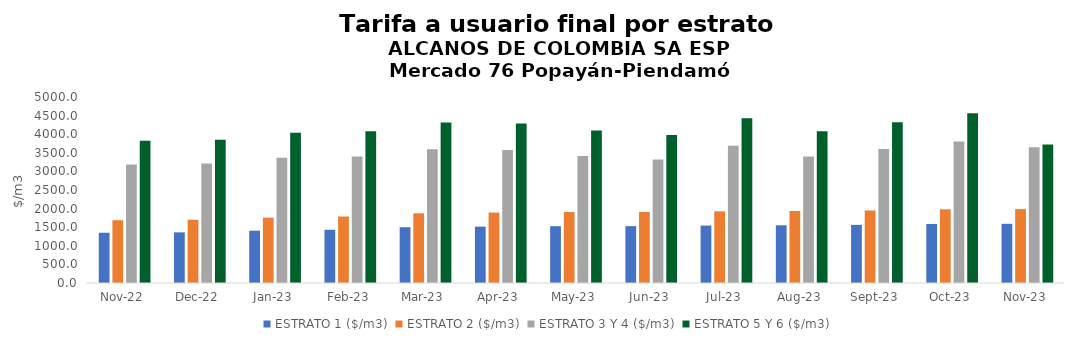
| Category | ESTRATO 1 ($/m3) | ESTRATO 2 ($/m3) | ESTRATO 3 Y 4 ($/m3) | ESTRATO 5 Y 6 ($/m3) |
|---|---|---|---|---|
| 2022-11-01 | 1350.95 | 1687.14 | 3185.9 | 3823.08 |
| 2022-12-01 | 1361.48 | 1700.11 | 3209.93 | 3851.916 |
| 2023-01-01 | 1406.32 | 1756.53 | 3365.49 | 4038.588 |
| 2023-02-01 | 1431.45 | 1787.62 | 3398.26 | 4077.912 |
| 2023-03-01 | 1499.4 | 1873.1 | 3596.1 | 4315.32 |
| 2023-04-01 | 1515.22 | 1892.7 | 3575.22 | 4290.264 |
| 2023-05-01 | 1527.06 | 1907.55 | 3416.65 | 4099.98 |
| 2023-06-01 | 1528.08 | 1909 | 3316.57 | 3979.884 |
| 2023-07-01 | 1543.84 | 1926.61 | 3689.81 | 4427.772 |
| 2023-08-01 | 1551.43 | 1936.32 | 3401.48 | 4081.776 |
| 2023-09-01 | 1562.51 | 1949.77 | 3603.59 | 4324.308 |
| 2023-10-01 | 1587.1 | 1981.56 | 3805.44 | 4566.528 |
| 2023-11-01 | 1591.15 | 1986.35 | 3648.51 | 3721.48 |